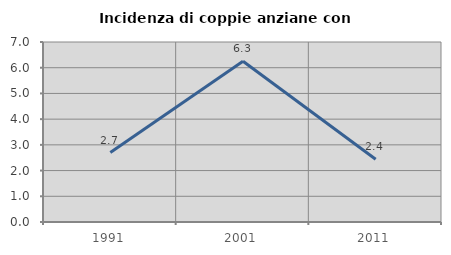
| Category | Incidenza di coppie anziane con figli |
|---|---|
| 1991.0 | 2.703 |
| 2001.0 | 6.25 |
| 2011.0 | 2.439 |